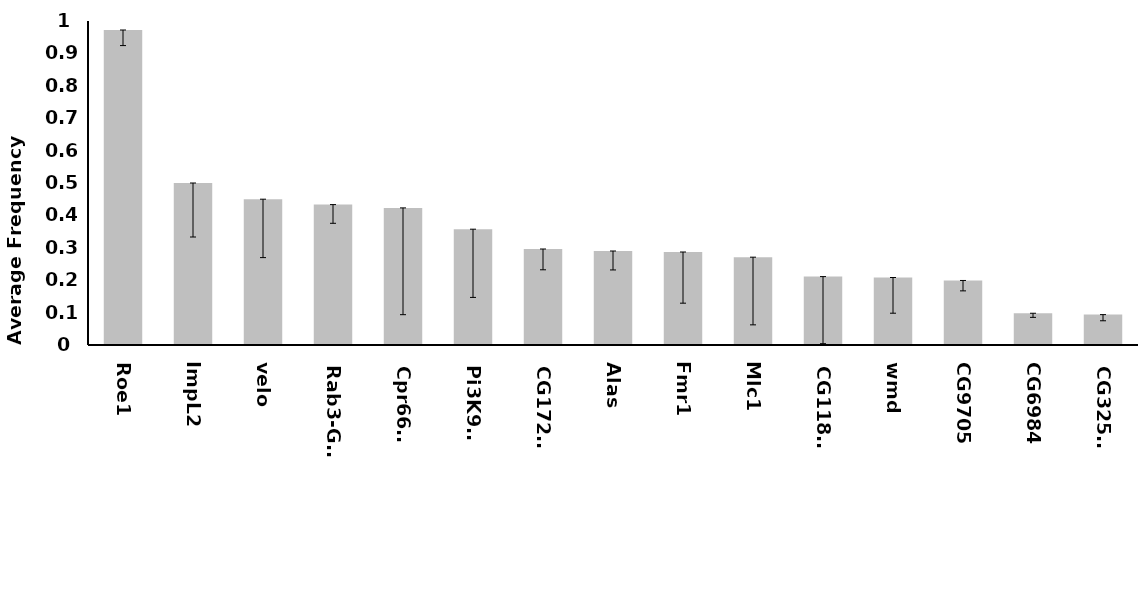
| Category | Roe1 |
|---|---|
| Roe1 | 0.972 |
| ImpL2 | 0.5 |
| velo | 0.45 |
| Rab3-GEF | 0.433 |
| Cpr66Ca | 0.423 |
| Pi3K92E | 0.357 |
| CG17271 | 0.296 |
| Alas | 0.29 |
| Fmr1 | 0.287 |
| Mlc1 | 0.271 |
| CG11878 | 0.211 |
| wmd | 0.208 |
| CG9705 | 0.199 |
| CG6984 | 0.098 |
| CG32549 | 0.094 |